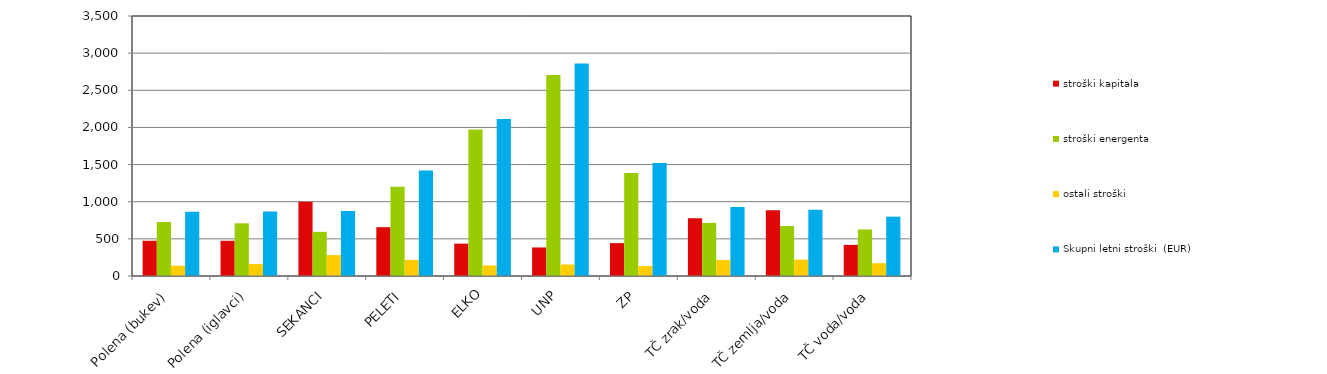
| Category | stroški kapitala | stroški energenta | ostali stroški | Skupni letni stroški  (EUR) |
|---|---|---|---|---|
| Polena (bukev) | 474.643 | 726.7 | 138.35 | 865.05 |
| Polena (iglavci) | 474.643 | 709.107 | 160.25 | 869.357 |
| SEKANCI | 998.182 | 594.011 | 281.2 | 875.211 |
| PELETI | 657.166 | 1201.796 | 217.2 | 1418.996 |
| ELKO | 435.615 | 1972.338 | 142.2 | 2114.538 |
| UNP | 384.447 | 2705.359 | 154.65 | 2860.009 |
| ZP | 442.71 | 1386.306 | 134.15 | 1520.456 |
| TČ zrak/voda | 777.671 | 715 | 214.3 | 929.3 |
| TČ zemlja/voda | 886.117 | 672.333 | 220.8 | 893.133 |
| TČ voda/voda | 418.829 | 626.261 | 172.5 | 798.761 |